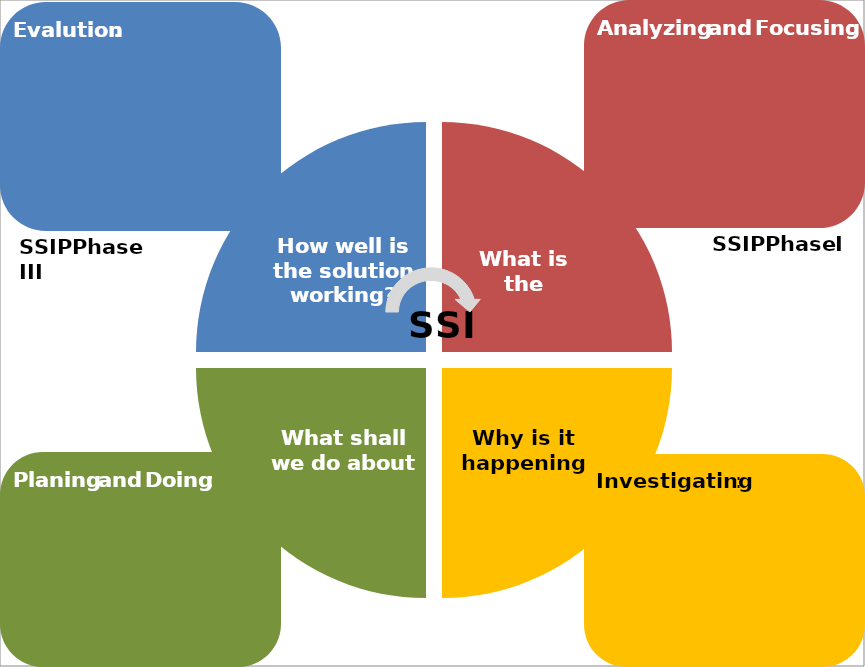
| Category | Series 0 |
|---|---|
| 0 | 25 |
| 1 | 25 |
| 2 | 25 |
| 3 | 25 |